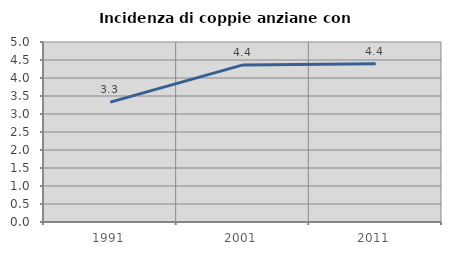
| Category | Incidenza di coppie anziane con figli |
|---|---|
| 1991.0 | 3.33 |
| 2001.0 | 4.364 |
| 2011.0 | 4.393 |